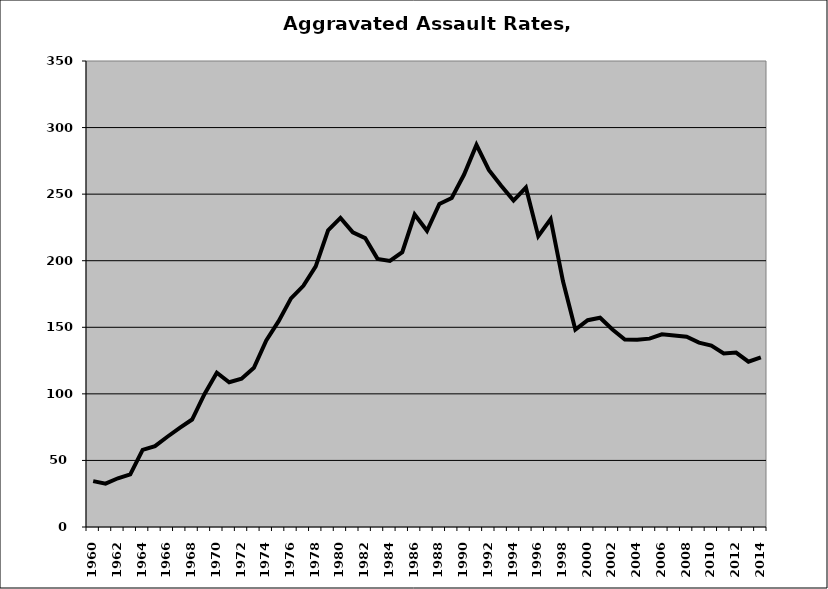
| Category | Aggravated Assault |
|---|---|
| 1960.0 | 34.482 |
| 1961.0 | 32.523 |
| 1962.0 | 36.595 |
| 1963.0 | 39.497 |
| 1964.0 | 57.901 |
| 1965.0 | 60.722 |
| 1966.0 | 67.783 |
| 1967.0 | 74.508 |
| 1968.0 | 80.719 |
| 1969.0 | 99.758 |
| 1970.0 | 115.856 |
| 1971.0 | 108.721 |
| 1972.0 | 111.36 |
| 1973.0 | 119.514 |
| 1974.0 | 140.151 |
| 1975.0 | 154.578 |
| 1976.0 | 171.721 |
| 1977.0 | 181.114 |
| 1978.0 | 195.758 |
| 1979.0 | 222.803 |
| 1980.0 | 232.167 |
| 1981.0 | 221.251 |
| 1982.0 | 217.014 |
| 1983.0 | 201.377 |
| 1984.0 | 199.86 |
| 1985.0 | 206.431 |
| 1986.0 | 234.663 |
| 1987.0 | 222.459 |
| 1988.0 | 242.651 |
| 1989.0 | 247.089 |
| 1990.0 | 264.725 |
| 1991.0 | 286.982 |
| 1992.0 | 268.219 |
| 1993.0 | 256.343 |
| 1994.0 | 245.145 |
| 1995.0 | 254.982 |
| 1996.0 | 218.428 |
| 1997.0 | 231.2 |
| 1998.0 | 184.512 |
| 1999.0 | 148.223 |
| 2000.0 | 155.34 |
| 2001.0 | 157.211 |
| 2002.0 | 148.325 |
| 2003.0 | 140.798 |
| 2004.0 | 140.679 |
| 2005.0 | 141.474 |
| 2006.0 | 144.746 |
| 2007.0 | 143.866 |
| 2008.0 | 142.895 |
| 2009.0 | 138.521 |
| 2010.0 | 136.194 |
| 2011.0 | 130.387 |
| 2012.0 | 131.048 |
| 2013.0 | 124.179 |
| 2014.0 | 127.4 |